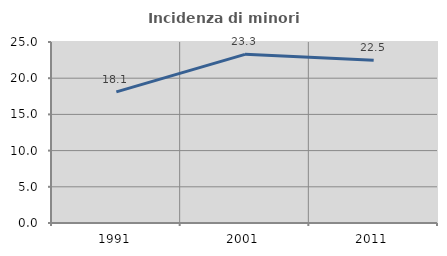
| Category | Incidenza di minori stranieri |
|---|---|
| 1991.0 | 18.112 |
| 2001.0 | 23.293 |
| 2011.0 | 22.495 |